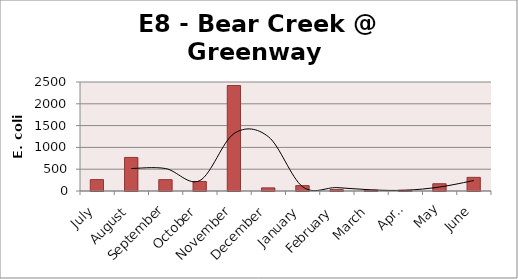
| Category | E. coli MPN |
|---|---|
| July | 261.3 |
| August | 770.1 |
| September | 260.2 |
| October | 218.7 |
| November | 2419.2 |
| December | 71.7 |
| January | 123.6 |
| February | 32.3 |
| March | 19.7 |
| April | 15.5 |
| May | 167 |
| June | 313 |